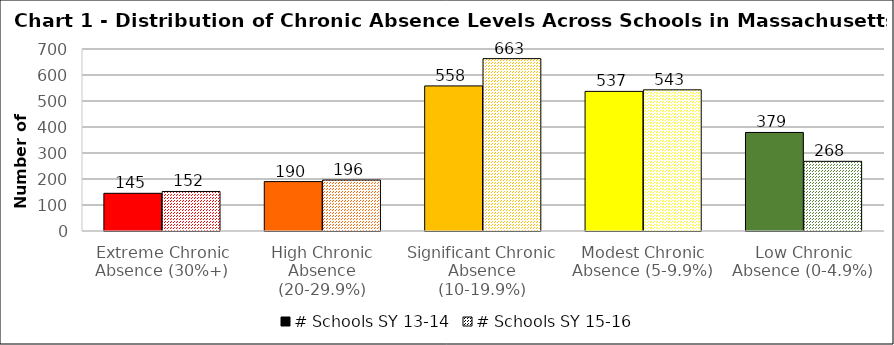
| Category | # Schools SY 13-14 | # Schools SY 15-16 |
|---|---|---|
| Extreme Chronic Absence (30%+) | 145 | 152 |
| High Chronic Absence (20-29.9%) | 190 | 196 |
| Significant Chronic Absence (10-19.9%) | 558 | 663 |
| Modest Chronic Absence (5-9.9%) | 537 | 543 |
| Low Chronic Absence (0-4.9%) | 379 | 268 |